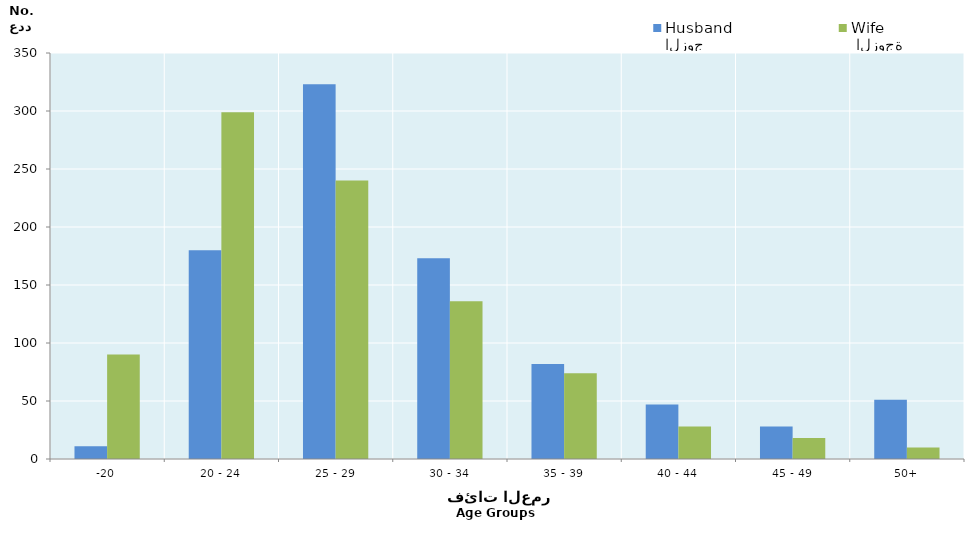
| Category | الزوج
Husband |  الزوجة
Wife |
|---|---|---|
| -20 | 11 | 90 |
| 20 - 24 | 180 | 299 |
| 25 - 29 | 323 | 240 |
| 30 - 34 | 173 | 136 |
| 35 - 39 | 82 | 74 |
| 40 - 44 | 47 | 28 |
| 45 - 49 | 28 | 18 |
| 50+ | 51 | 10 |